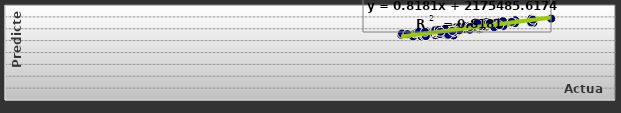
| Category | Series 0 |
|---|---|
| 13858702.0 | 12980807.584 |
| 12869483.0 | 12388866.118 |
| 13152556.0 | 12817975.967 |
| 11561734.0 | 11195381.202 |
| 11069726.0 | 11158126.876 |
| 11839202.0 | 11303404.076 |
| 12438276.0 | 11898133.105 |
| 11492121.0 | 11125086.644 |
| 11764633.0 | 10865498.527 |
| 11947093.0 | 11729819.207 |
| 12427893.0 | 12188610.447 |
| 13223170.0 | 13094054.319 |
| 13805270.0 | 13686251.931 |
| 12102540.0 | 12140403.985 |
| 12624249.0 | 12364837.039 |
| 11247397.0 | 11356342.759 |
| 10393439.0 | 10968541.33 |
| 10939061.0 | 10827930.915 |
| 10702529.0 | 10700522.628 |
| 11096330.0 | 11598047.946 |
| 10929407.0 | 10675280.566 |
| 11305136.0 | 11695770.931 |
| 11503015.0 | 11782004.212 |
| 13245874.0 | 12949212.786 |
| 13204084.0 | 13066818.825 |
| 11741623.0 | 12099671.301 |
| 12214133.0 | 12057965.594 |
| 10528793.0 | 11041394.765 |
| 10748956.0 | 11242072.944 |
| 11289127.0 | 10900602.101 |
| 12370469.0 | 12570408.231 |
| 11833527.0 | 12237369.212 |
| 11142350.0 | 11206613.76 |
| 11366088.0 | 11580637.37 |
| 12065540.0 | 11909851.434 |
| 12635837.0 | 13154903.015 |
| 13378455.0 | 13447130.887 |
| 11922830.0 | 12305424.318 |
| 12516214.0 | 12645152.887 |
| 10812323.0 | 11434175.295 |
| 10414660.0 | 11204552.321 |
| 10990459.0 | 10778769.196 |
| 12356931.0 | 13083067.734 |
| 11520818.0 | 11759595.905 |
| 10995940.0 | 11122087.177 |
| 11346656.0 | 11633320.8 |
| 11585051.0 | 11830070.793 |
| 12438572.0 | 12735181.102 |
| 13377585.0 | 12955553.996 |
| 12297942.0 | 12175283.712 |
| 12189029.0 | 11826274.62 |
| 11164412.0 | 11489403.933 |
| 11015358.0 | 11138394.806 |
| 11741791.0 | 11558954.69 |
| 12890028.0 | 13023686.379 |
| 11776865.0 | 11736043.537 |
| 10556493.0 | 11099097.904 |
| 11616925.0 | 11605262.752 |
| 12440484.0 | 12167884.749 |
| 12649911.0 | 12720775.871 |
| 13801260.0 | 13065071.898 |
| 12529882.0 | 12420086.075 |
| 12709104.0 | 12683216.73 |
| 11611418.0 | 11603514.176 |
| 11147570.0 | 11371659.734 |
| 11517408.0 | 11031868.748 |
| 12829750.0 | 12277192.773 |
| 11739886.0 | 11495056.912 |
| 11468546.0 | 11264582.444 |
| 11897269.0 | 11618128.582 |
| 12327734.0 | 12345371.017 |
| 13086730.0 | 13296498.574 |
| 14326837.0 | 13703620.44 |
| 12655041.0 | 12864952.436 |
| 13288297.0 | 13158720.688 |
| 11360191.0 | 11604484.771 |
| 10963756.0 | 11209954.268 |
| 11648160.0 | 11267979.834 |
| 11766636.0 | 11406649.349 |
| 11308925.0 | 11258552.608 |
| 11411972.0 | 11100650.708 |
| 11724784.0 | 11670082.53 |
| 12451107.0 | 12443615.84 |
| 12712680.0 | 12914556.643 |
| 13848062.0 | 13530554.534 |
| 12995679.0 | 13202194.784 |
| 13073688.0 | 12476016.493 |
| 11297907.0 | 11550964.484 |
| 10857342.0 | 11500437.398 |
| 11039303.0 | 10755457.117 |
| 11914109.0 | 11739255.881 |
| 11281584.0 | 11635133.982 |
| 11694075.0 | 11570983.751 |
| 11285079.0 | 11762360.711 |
| 11539716.0 | 11979539.445 |
| 12074225.0 | 12443126.243 |
| 13060489.0 | 13280677.583 |
| 12179908.0 | 12472625.259 |
| 12201102.0 | 12310456.746 |
| 11377256.0 | 11821182.574 |
| 11016861.0 | 11482779.75 |
| 11598866.0 | 10904319.41 |
| 12389229.0 | 12618237.204 |
| 12966123.0 | 12608287.9 |
| 11625065.0 | 10987158.751 |
| 11422724.0 | 11491502.753 |
| 11734355.0 | 11628854.553 |
| 12387423.0 | 12957667.9 |